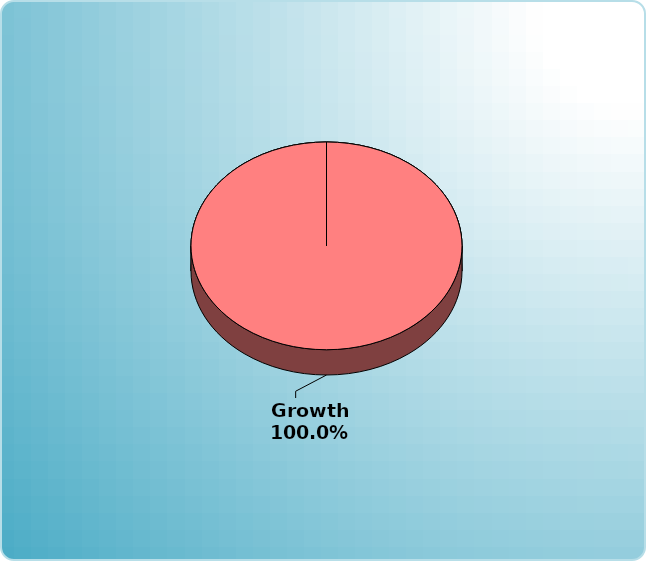
| Category | Series 0 |
|---|---|
| Cash | 0 |
| Bonds | 0 |
| Muni Bond | 0 |
| Hybrid bond | 0 |
| Value | 0 |
| Growth | 5000 |
| Small-Cap | 0 |
| Tangibles | 0 |
| International | 0 |
| Personal Property | 0 |
| Miscellaneous | 0 |